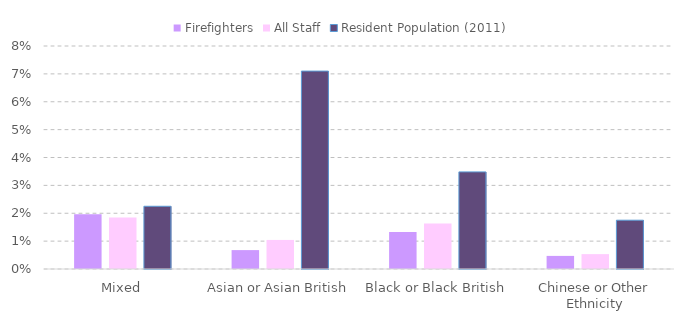
| Category | Firefighters | All Staff | Resident Population (2011) |
|---|---|---|---|
| Mixed | 0.02 | 0.019 | 0.023 |
| Asian or Asian British | 0.007 | 0.01 | 0.071 |
| Black or Black British | 0.013 | 0.016 | 0.035 |
| Chinese or Other Ethnicity | 0.005 | 0.005 | 0.018 |